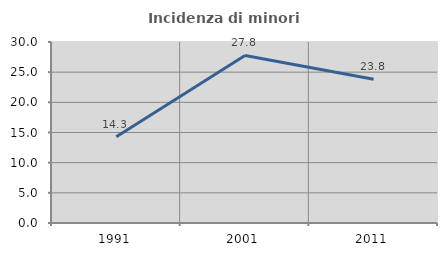
| Category | Incidenza di minori stranieri |
|---|---|
| 1991.0 | 14.286 |
| 2001.0 | 27.778 |
| 2011.0 | 23.81 |